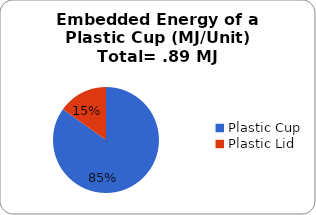
| Category | Series 0 |
|---|---|
| Plastic Cup  | 0.757 |
| Plastic Lid  | 0.135 |